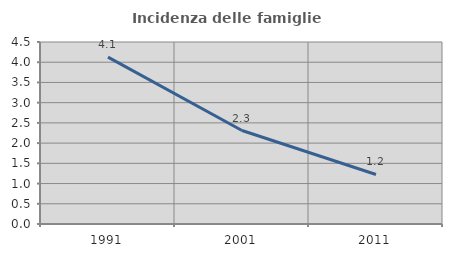
| Category | Incidenza delle famiglie numerose |
|---|---|
| 1991.0 | 4.127 |
| 2001.0 | 2.312 |
| 2011.0 | 1.224 |